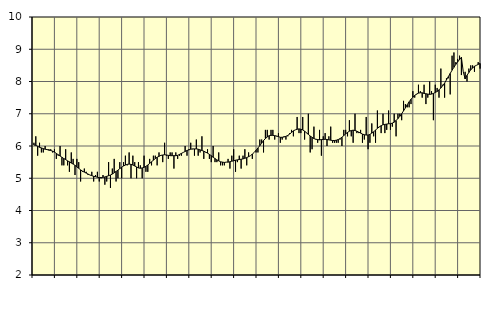
| Category | Information och kommunikation, SNI 58-63 | Series 1 |
|---|---|---|
| nan | 6.1 | 6.03 |
| 1.0 | 6.3 | 6.02 |
| 1.0 | 5.7 | 5.99 |
| 1.0 | 6.1 | 5.96 |
| 1.0 | 5.8 | 5.94 |
| 1.0 | 5.8 | 5.92 |
| 1.0 | 6 | 5.9 |
| 1.0 | 5.9 | 5.89 |
| 1.0 | 5.9 | 5.87 |
| 1.0 | 5.9 | 5.86 |
| 1.0 | 5.8 | 5.84 |
| 1.0 | 5.9 | 5.81 |
| nan | 5.6 | 5.77 |
| 2.0 | 5.7 | 5.73 |
| 2.0 | 6 | 5.69 |
| 2.0 | 5.4 | 5.65 |
| 2.0 | 5.4 | 5.61 |
| 2.0 | 5.9 | 5.58 |
| 2.0 | 5.4 | 5.54 |
| 2.0 | 5.2 | 5.51 |
| 2.0 | 5.8 | 5.47 |
| 2.0 | 5.6 | 5.44 |
| 2.0 | 5.1 | 5.4 |
| 2.0 | 5.6 | 5.35 |
| nan | 5.5 | 5.31 |
| 3.0 | 4.9 | 5.26 |
| 3.0 | 5.2 | 5.22 |
| 3.0 | 5.3 | 5.19 |
| 3.0 | 5.2 | 5.16 |
| 3.0 | 5.1 | 5.13 |
| 3.0 | 5.1 | 5.1 |
| 3.0 | 5.2 | 5.08 |
| 3.0 | 4.9 | 5.06 |
| 3.0 | 5.1 | 5.05 |
| 3.0 | 5.2 | 5.03 |
| 3.0 | 4.9 | 5.02 |
| nan | 5 | 5.02 |
| 4.0 | 5.1 | 5.03 |
| 4.0 | 4.8 | 5.04 |
| 4.0 | 4.9 | 5.06 |
| 4.0 | 5.5 | 5.08 |
| 4.0 | 4.7 | 5.1 |
| 4.0 | 5.3 | 5.13 |
| 4.0 | 5.6 | 5.17 |
| 4.0 | 4.9 | 5.21 |
| 4.0 | 5 | 5.25 |
| 4.0 | 5.5 | 5.3 |
| 4.0 | 5 | 5.34 |
| nan | 5.5 | 5.38 |
| 5.0 | 5.7 | 5.41 |
| 5.0 | 5.4 | 5.43 |
| 5.0 | 5.8 | 5.44 |
| 5.0 | 5 | 5.43 |
| 5.0 | 5.7 | 5.41 |
| 5.0 | 5.5 | 5.38 |
| 5.0 | 5 | 5.35 |
| 5.0 | 5.5 | 5.32 |
| 5.0 | 5.4 | 5.31 |
| 5.0 | 5 | 5.32 |
| 5.0 | 5.7 | 5.34 |
| nan | 5.2 | 5.37 |
| 6.0 | 5.2 | 5.41 |
| 6.0 | 5.6 | 5.46 |
| 6.0 | 5.4 | 5.51 |
| 6.0 | 5.7 | 5.56 |
| 6.0 | 5.7 | 5.61 |
| 6.0 | 5.4 | 5.65 |
| 6.0 | 5.8 | 5.68 |
| 6.0 | 5.7 | 5.71 |
| 6.0 | 5.5 | 5.72 |
| 6.0 | 6.1 | 5.73 |
| 6.0 | 5.7 | 5.72 |
| nan | 5.6 | 5.71 |
| 7.0 | 5.8 | 5.7 |
| 7.0 | 5.8 | 5.7 |
| 7.0 | 5.3 | 5.7 |
| 7.0 | 5.8 | 5.7 |
| 7.0 | 5.6 | 5.71 |
| 7.0 | 5.7 | 5.74 |
| 7.0 | 5.7 | 5.77 |
| 7.0 | 5.8 | 5.8 |
| 7.0 | 6 | 5.83 |
| 7.0 | 5.7 | 5.86 |
| 7.0 | 5.9 | 5.88 |
| nan | 6.1 | 5.9 |
| 8.0 | 5.9 | 5.91 |
| 8.0 | 5.7 | 5.91 |
| 8.0 | 6.2 | 5.91 |
| 8.0 | 5.7 | 5.9 |
| 8.0 | 5.8 | 5.88 |
| 8.0 | 6.3 | 5.86 |
| 8.0 | 5.6 | 5.84 |
| 8.0 | 5.8 | 5.81 |
| 8.0 | 5.9 | 5.78 |
| 8.0 | 5.6 | 5.74 |
| 8.0 | 5.5 | 5.7 |
| nan | 6 | 5.65 |
| 9.0 | 5.5 | 5.61 |
| 9.0 | 5.5 | 5.57 |
| 9.0 | 5.8 | 5.54 |
| 9.0 | 5.4 | 5.51 |
| 9.0 | 5.4 | 5.5 |
| 9.0 | 5.4 | 5.49 |
| 9.0 | 5.5 | 5.5 |
| 9.0 | 5.6 | 5.5 |
| 9.0 | 5.3 | 5.51 |
| 9.0 | 5.7 | 5.53 |
| 9.0 | 5.9 | 5.54 |
| nan | 5.2 | 5.56 |
| 10.0 | 5.5 | 5.57 |
| 10.0 | 5.7 | 5.58 |
| 10.0 | 5.3 | 5.59 |
| 10.0 | 5.7 | 5.6 |
| 10.0 | 5.9 | 5.62 |
| 10.0 | 5.4 | 5.64 |
| 10.0 | 5.8 | 5.67 |
| 10.0 | 5.7 | 5.7 |
| 10.0 | 5.6 | 5.75 |
| 10.0 | 5.8 | 5.8 |
| 10.0 | 5.8 | 5.87 |
| nan | 5.8 | 5.94 |
| 11.0 | 6.2 | 6.01 |
| 11.0 | 6.2 | 6.09 |
| 11.0 | 5.8 | 6.17 |
| 11.0 | 6.5 | 6.23 |
| 11.0 | 6.5 | 6.28 |
| 11.0 | 6.2 | 6.32 |
| 11.0 | 6.5 | 6.33 |
| 11.0 | 6.5 | 6.33 |
| 11.0 | 6.2 | 6.32 |
| 11.0 | 6.3 | 6.31 |
| 11.0 | 6.4 | 6.29 |
| nan | 6.1 | 6.27 |
| 12.0 | 6.2 | 6.27 |
| 12.0 | 6.3 | 6.28 |
| 12.0 | 6.2 | 6.3 |
| 12.0 | 6.3 | 6.33 |
| 12.0 | 6.4 | 6.37 |
| 12.0 | 6.5 | 6.42 |
| 12.0 | 6.3 | 6.47 |
| 12.0 | 6.5 | 6.5 |
| 12.0 | 6.9 | 6.52 |
| 12.0 | 6.4 | 6.53 |
| 12.0 | 6.4 | 6.52 |
| nan | 6.9 | 6.5 |
| 13.0 | 6.2 | 6.46 |
| 13.0 | 6.4 | 6.41 |
| 13.0 | 7 | 6.36 |
| 13.0 | 5.8 | 6.31 |
| 13.0 | 5.9 | 6.27 |
| 13.0 | 6.6 | 6.23 |
| 13.0 | 6.2 | 6.21 |
| 13.0 | 6.1 | 6.2 |
| 13.0 | 6.5 | 6.19 |
| 13.0 | 5.7 | 6.2 |
| 13.0 | 6.3 | 6.2 |
| nan | 6.4 | 6.21 |
| 14.0 | 6 | 6.2 |
| 14.0 | 6.3 | 6.19 |
| 14.0 | 6.6 | 6.18 |
| 14.0 | 6.1 | 6.17 |
| 14.0 | 6.1 | 6.17 |
| 14.0 | 6.1 | 6.18 |
| 14.0 | 6.1 | 6.2 |
| 14.0 | 6.2 | 6.23 |
| 14.0 | 6 | 6.27 |
| 14.0 | 6.5 | 6.32 |
| 14.0 | 6.5 | 6.38 |
| nan | 6.3 | 6.42 |
| 15.0 | 6.8 | 6.46 |
| 15.0 | 6.3 | 6.48 |
| 15.0 | 6.1 | 6.49 |
| 15.0 | 7 | 6.48 |
| 15.0 | 6.4 | 6.46 |
| 15.0 | 6.4 | 6.43 |
| 15.0 | 6.5 | 6.4 |
| 15.0 | 6.1 | 6.37 |
| 15.0 | 6.2 | 6.35 |
| 15.0 | 6.9 | 6.34 |
| 15.0 | 5.9 | 6.34 |
| nan | 6.1 | 6.36 |
| 16.0 | 6.7 | 6.4 |
| 16.0 | 6.3 | 6.44 |
| 16.0 | 6.1 | 6.49 |
| 16.0 | 7.1 | 6.55 |
| 16.0 | 6.6 | 6.59 |
| 16.0 | 6.4 | 6.63 |
| 16.0 | 7 | 6.66 |
| 16.0 | 6.4 | 6.67 |
| 16.0 | 6.5 | 6.68 |
| 16.0 | 7.1 | 6.69 |
| 16.0 | 6.5 | 6.69 |
| nan | 6.6 | 6.71 |
| 17.0 | 7 | 6.74 |
| 17.0 | 6.3 | 6.79 |
| 17.0 | 7 | 6.85 |
| 17.0 | 7 | 6.92 |
| 17.0 | 6.8 | 7 |
| 17.0 | 7.4 | 7.09 |
| 17.0 | 7.3 | 7.18 |
| 17.0 | 7.2 | 7.28 |
| 17.0 | 7.2 | 7.37 |
| 17.0 | 7.3 | 7.45 |
| 17.0 | 7.7 | 7.51 |
| nan | 7.5 | 7.57 |
| 18.0 | 7.6 | 7.61 |
| 18.0 | 7.9 | 7.64 |
| 18.0 | 7.7 | 7.65 |
| 18.0 | 7.5 | 7.65 |
| 18.0 | 7.9 | 7.63 |
| 18.0 | 7.3 | 7.62 |
| 18.0 | 7.5 | 7.61 |
| 18.0 | 8 | 7.6 |
| 18.0 | 7.7 | 7.61 |
| 18.0 | 6.8 | 7.63 |
| 18.0 | 7.9 | 7.66 |
| nan | 7.8 | 7.69 |
| 19.0 | 7.5 | 7.74 |
| 19.0 | 8.4 | 7.8 |
| 19.0 | 7.9 | 7.87 |
| 19.0 | 7.5 | 7.95 |
| 19.0 | 8.1 | 8.05 |
| 19.0 | 8.1 | 8.15 |
| 19.0 | 7.6 | 8.25 |
| 19.0 | 8.8 | 8.35 |
| 19.0 | 8.9 | 8.44 |
| 19.0 | 8.6 | 8.53 |
| 19.0 | 8.7 | 8.61 |
| nan | 8.8 | 8.68 |
| 20.0 | 8.2 | 8.75 |
| 20.0 | 8.3 | 8.3 |
| 20.0 | 8.3 | 8.08 |
| 20.0 | 8 | 8.19 |
| 20.0 | 8.4 | 8.28 |
| 20.0 | 8.5 | 8.36 |
| 20.0 | 8.5 | 8.42 |
| 20.0 | 8.3 | 8.47 |
| 20.0 | 8.5 | 8.5 |
| 20.0 | 8.6 | 8.53 |
| 20.0 | 8.4 | 8.56 |